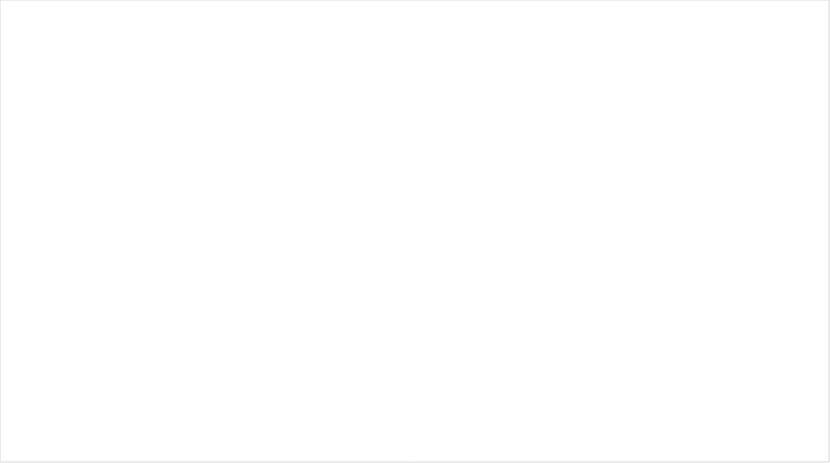
| Category |  APROPIACION
 VIGENTE |  COMPROMISOS
 ACUMULADOS |  OBLIGACIONES
 ACUMULADAS |  PAGOS
 ACUMULADOS |
|---|---|---|---|---|
| A-01 -GASTOS DE PERSONAL | 51464.345 | 24057.771 | 24057.771 | 22936.15 |
| A-02 -ADQUISICIÓN DE BIENES  Y SERVICIOS | 19419.071 | 15061.758 | 7974.968 | 7972.601 |
| A-03-TRANSFERENCIAS CORRIENTES | 14851.097 | 85.358 | 85.358 | 85.358 |
| A-08-GASTOS POR TRIBUTOS, MULTAS, SANCIONES E INTERESES DE MORA | 14051.472 | 0 | 0 | 0 |